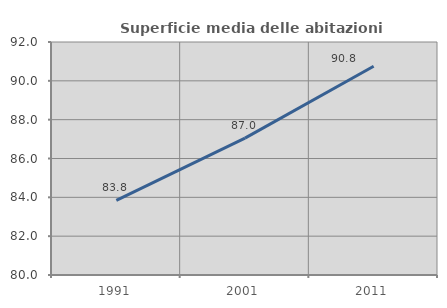
| Category | Superficie media delle abitazioni occupate |
|---|---|
| 1991.0 | 83.846 |
| 2001.0 | 87.049 |
| 2011.0 | 90.75 |